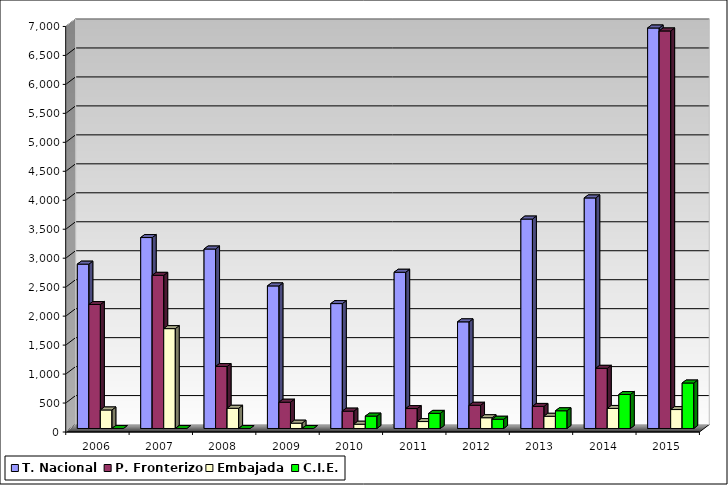
| Category | T. Nacional | P. Fronterizo | Embajada | C.I.E. |
|---|---|---|---|---|
| 2006.0 | 2837 | 2140 | 320 | 0 |
| 2007.0 | 3296 | 2644 | 1724 | 0 |
| 2008.0 | 3098 | 1070 | 349 | 0 |
| 2009.0 | 2461 | 454 | 92 | 0 |
| 2010.0 | 2156 | 300 | 74 | 214 |
| 2011.0 | 2697 | 344 | 120 | 261 |
| 2012.0 | 1841 | 401 | 186 | 160 |
| 2013.0 | 3615 | 381 | 211 | 306 |
| 2014.0 | 3980 | 1039 | 346 | 587 |
| 2015.0 | 6913 | 6862 | 327 | 785 |